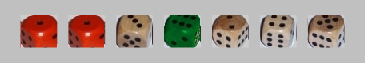
| Category | 1 | 2 | 3 | 4 | 5 | 6 |
|---|---|---|---|---|---|---|
| 1.0 | 1 | 0 | 0 | 0 | 0 | 0 |
| 1.0 | 1 | 0 | 0 | 0 | 0 | 0 |
| 3.0 | -1 | 0 | 1 | 0 | 0 | 0 |
| 6.0 | -1 | 0 | 0 | 0 | 0 | 1 |
| 2.0 | -1 | 1 | 0 | 0 | 0 | 0 |
| 4.0 | -1 | 0 | 0 | 1 | 0 | 0 |
| 5.0 | -1 | 0 | 0 | 0 | 1 | 0 |